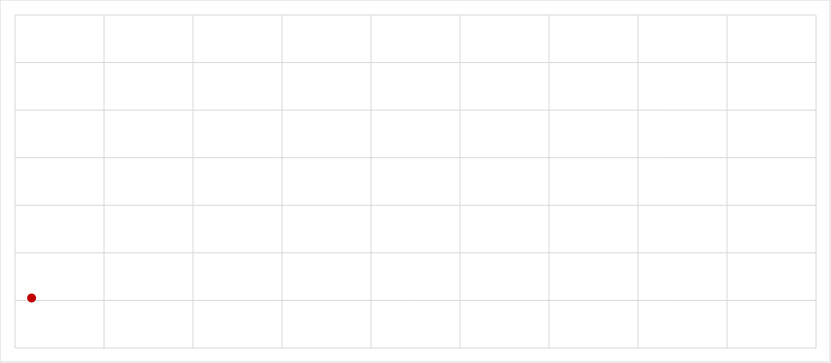
| Category | Series 0 |
|---|---|
| 0.9329505944340185 | 2.103 |